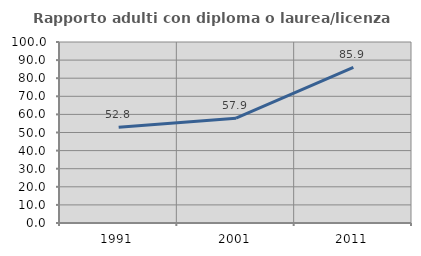
| Category | Rapporto adulti con diploma o laurea/licenza media  |
|---|---|
| 1991.0 | 52.847 |
| 2001.0 | 57.895 |
| 2011.0 | 85.942 |